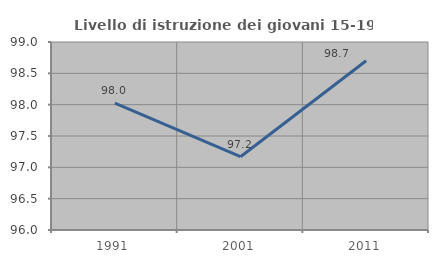
| Category | Livello di istruzione dei giovani 15-19 anni |
|---|---|
| 1991.0 | 98.026 |
| 2001.0 | 97.17 |
| 2011.0 | 98.701 |